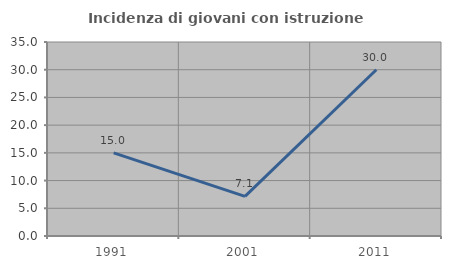
| Category | Incidenza di giovani con istruzione universitaria |
|---|---|
| 1991.0 | 15 |
| 2001.0 | 7.143 |
| 2011.0 | 30 |